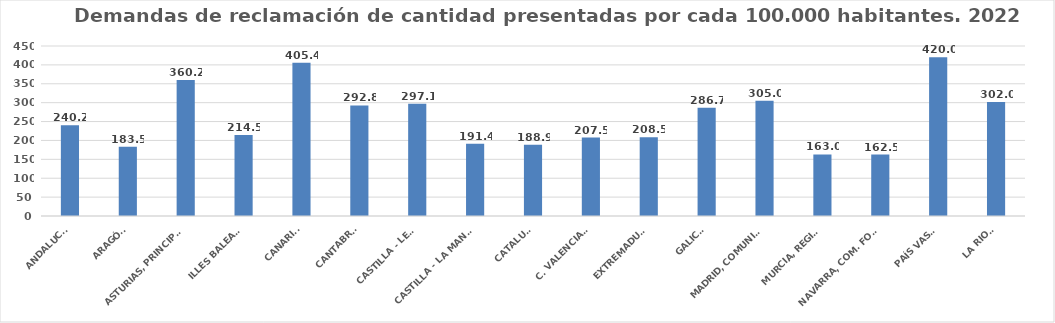
| Category | Series 0 |
|---|---|
| ANDALUCÍA | 240.227 |
| ARAGÓN | 183.516 |
| ASTURIAS, PRINCIPADO | 360.212 |
| ILLES BALEARS | 214.506 |
| CANARIAS | 405.428 |
| CANTABRIA | 292.79 |
| CASTILLA - LEÓN | 297.095 |
| CASTILLA - LA MANCHA | 191.445 |
| CATALUÑA | 188.897 |
| C. VALENCIANA | 207.534 |
| EXTREMADURA | 208.48 |
| GALICIA | 286.679 |
| MADRID, COMUNIDAD | 304.963 |
| MURCIA, REGIÓN | 163.003 |
| NAVARRA, COM. FORAL | 162.471 |
| PAÍS VASCO | 419.985 |
| LA RIOJA | 301.977 |